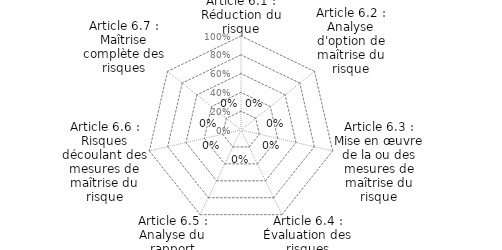
| Category | Series 0 |
|---|---|
| Article 6.1 : Réduction du risque | 0 |
| Article 6.2 : Analyse d'option de maîtrise du risque | 0 |
| Article 6.3 : Mise en œuvre de la ou des mesures de maîtrise du risque | 0 |
| Article 6.4 : Évaluation des risques résiduels | 0 |
| Article 6.5 : Analyse du rapport bénéfice/risque | 0 |
| Article 6.6 : Risques découlant des mesures de maîtrise du risque | 0 |
| Article 6.7 : Maîtrise complète des risques | 0 |